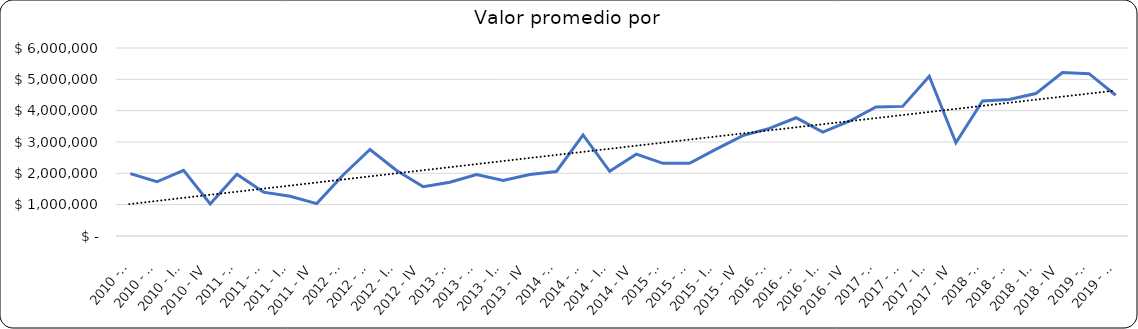
| Category | Valor m2 en Bogotá por sectores |
|---|---|
| 2010 - I | 1989316.239 |
| 2010 - II | 1730769.231 |
| 2010 - III | 2094017.094 |
| 2010 - IV | 1024358.974 |
| 2011 - I | 1972573.84 |
| 2011 - II | 1400843.882 |
| 2011 - III | 1265822.785 |
| 2011 - IV | 1033755.274 |
| 2012 - I | 1954238.095 |
| 2012 - II | 2761904.762 |
| 2012 - III | 2092857.143 |
| 2012 - IV | 1571428.571 |
| 2013 - I | 1715686.275 |
| 2013 - II | 1960294.118 |
| 2013 - III | 1774509.804 |
| 2013 - IV | 1961767.157 |
| 2014 - I | 2059701.493 |
| 2014 - II | 3225719.403 |
| 2014 - III | 2064676.617 |
| 2014 - IV | 2611940.299 |
| 2015 - I | 2320000 |
| 2015 - II | 2322222.222 |
| 2015 - III | 2773333.333 |
| 2015 - IV | 3204444.444 |
| 2016 - I | 3434684.685 |
| 2016 - II | 3773325.521 |
| 2016 - III | 3317129.63 |
| 2016 - IV | 3662280.702 |
| 2017 - I | 4115384.615 |
| 2017 - II | 4136597.938 |
| 2017 - III | 5097777.778 |
| 2017 - IV | 2973447.368 |
| 2018 - I | 4310344.828 |
| 2018 - II | 4354838.71 |
| 2018 - III | 4545455 |
| 2018 - IV | 5219464 |
| 2019 - I | 5181818 |
| 2019 - II | 4492754 |